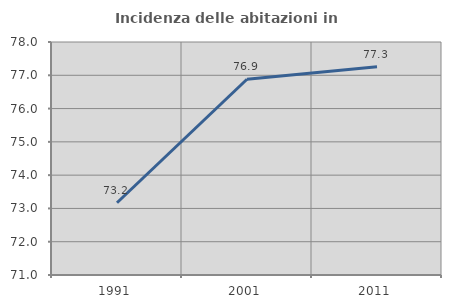
| Category | Incidenza delle abitazioni in proprietà  |
|---|---|
| 1991.0 | 73.171 |
| 2001.0 | 76.88 |
| 2011.0 | 77.259 |